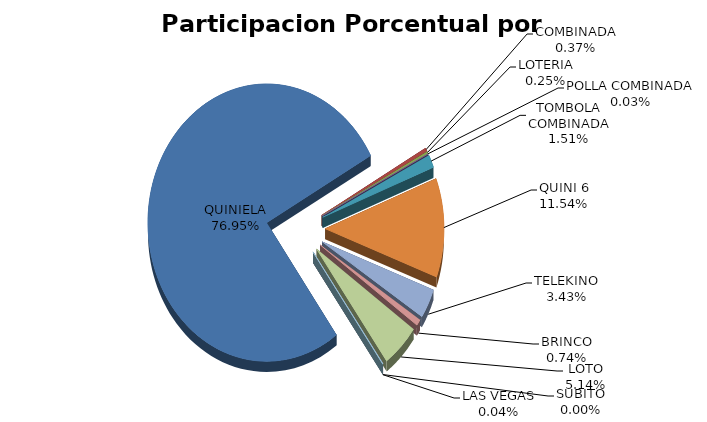
| Category | Series 0 |
|---|---|
| QUINIELA | 24561728.19 |
| COMBINADA | 118841.48 |
| LOTERIA | 80476.364 |
| POLLA COMBINADA | 10850.5 |
| TOMBOLA COMBINADA | 481063.5 |
| QUINI 6 | 3683448.21 |
| TELEKINO | 1094386.8 |
| BRINCO | 235166.658 |
| LOTO | 1639834.42 |
| SUBITO | 0 |
| LAS VEGAS | 12530.52 |